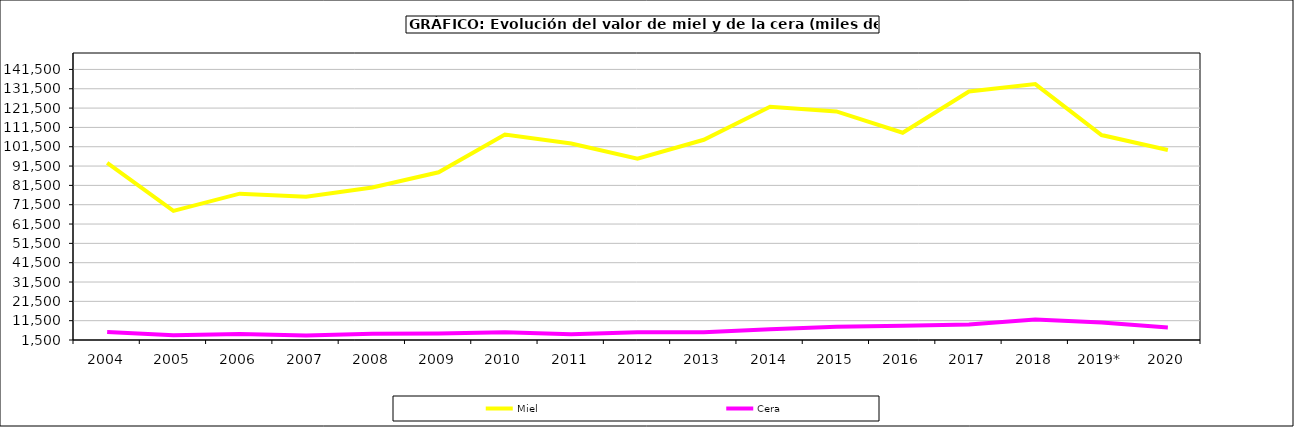
| Category | Miel | Cera |
|---|---|---|
| 2004 | 93106.002 | 5610.186 |
| 2005 | 68333.193 | 3903.341 |
| 2006 | 77210.535 | 4545.79 |
| 2007 | 75671.047 | 3782.043 |
| 2008 | 80408.918 | 4776.982 |
| 2009 | 88291.438 | 4877.522 |
| 2010 | 107827.095 | 5514.256 |
| 2011 | 103137.845 | 4533.385 |
| 2012 | 95366.296 | 5543.637 |
| 2013 | 105102.791 | 5553.321 |
| 2014 | 122217.175 | 7026.714 |
| 2015 | 119753.033 | 8392.273 |
| 2016 | 108750.281 | 8900.258 |
| 2017 | 130055.688 | 9514.815 |
| 2018 | 133889.869 | 12109.137 |
| 2019* | 107532.699 | 10532.872 |
| 2020 | 99828.49 | 7967.672 |